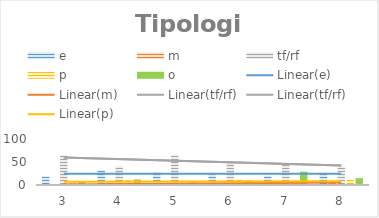
| Category | e | m | tf/rf | p | o |
|---|---|---|---|---|---|
| 3.0 | 19 | 0 | 65 | 8 | 8 |
| 4.0 | 31 | 6 | 41 | 10 | 12 |
| 5.0 | 28 | 0 | 65 | 1 | 6 |
| 6.0 | 23 | 6 | 48 | 12 | 10 |
| 7.0 | 20 | 0 | 47 | 4 | 29 |
| 8.0 | 26 | 8 | 40 | 11 | 15 |